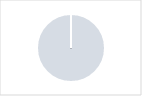
| Category | Series 0 |
|---|---|
| 0 | 0 |
| 1 | 12 |